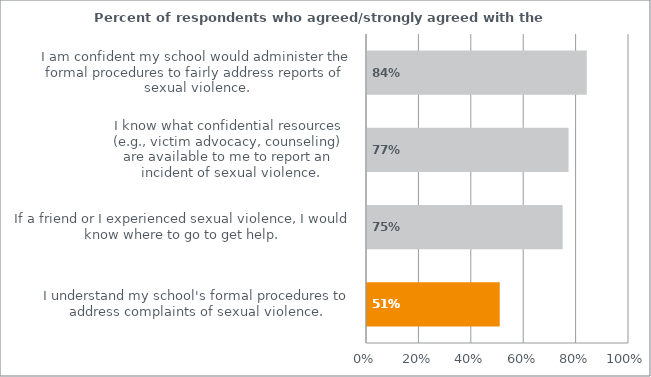
| Category | Percent |
|---|---|
| I understand my school's formal procedures to address complaints of sexual violence. | 0.507 |
| If a friend or I experienced sexual violence, I would know where to go to get help. | 0.747 |
| I know what confidential resources 
(e.g., victim advocacy, counseling) 
are available to me to report an 
incident of sexual violence. | 0.769 |
| I am confident my school would administer the formal procedures to fairly address reports of sexual violence. | 0.839 |